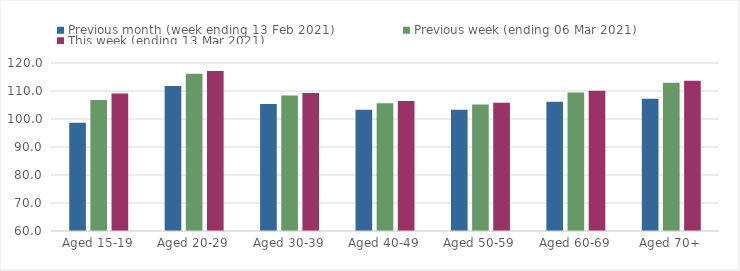
| Category | Previous month (week ending 13 Feb 2021) | Previous week (ending 06 Mar 2021) | This week (ending 13 Mar 2021) |
|---|---|---|---|
| Aged 15-19 | 98.66 | 106.81 | 109.14 |
| Aged 20-29 | 111.79 | 116.15 | 117.18 |
| Aged 30-39 | 105.36 | 108.42 | 109.27 |
| Aged 40-49 | 103.27 | 105.66 | 106.45 |
| Aged 50-59 | 103.26 | 105.22 | 105.8 |
| Aged 60-69 | 106.2 | 109.42 | 110.05 |
| Aged 70+ | 107.26 | 112.96 | 113.7 |